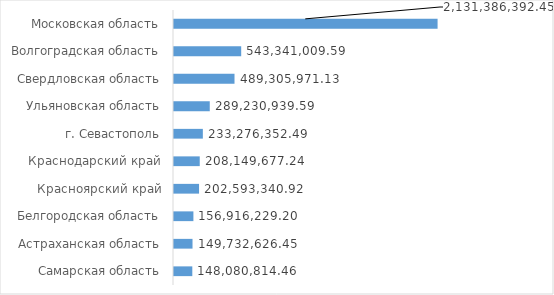
| Category | 2018 год |
|---|---|
| Московская область | 2131386392.45 |
| Волгоградская область | 543341009.59 |
| Свердловская область | 489305971.13 |
| Ульяновская область | 289230939.59 |
| г. Севастополь | 233276352.49 |
| Краснодарский край | 208149677.24 |
| Красноярский край | 202593340.92 |
| Белгородская область | 156916229.2 |
| Астраханская область | 149732626.45 |
| Самарская область | 148080814.46 |